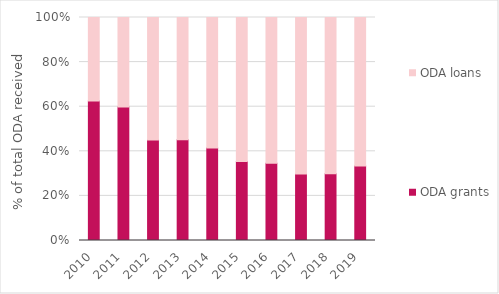
| Category | ODA grants | ODA loans |
|---|---|---|
| 2010.0 | 1261.935 | 755.384 |
| 2011.0 | 1232.257 | 824.906 |
| 2012.0 | 1235.259 | 1506.12 |
| 2013.0 | 1450.964 | 1764.429 |
| 2014.0 | 1243.937 | 1756.762 |
| 2015.0 | 1197.526 | 2180.353 |
| 2016.0 | 1192.917 | 2255.4 |
| 2017.0 | 1405.601 | 3311.961 |
| 2018.0 | 1532.153 | 3578.806 |
| 2019.0 | 1852.855 | 3697.803 |